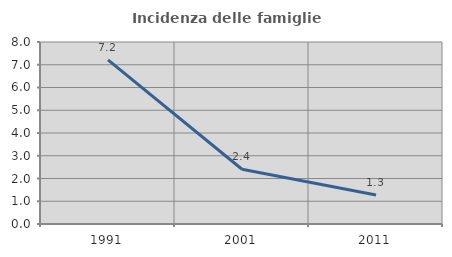
| Category | Incidenza delle famiglie numerose |
|---|---|
| 1991.0 | 7.213 |
| 2001.0 | 2.407 |
| 2011.0 | 1.277 |